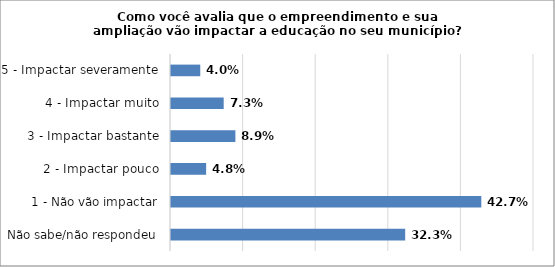
| Category | Series 0 |
|---|---|
| Não sabe/não respondeu | 0.323 |
| 1 - Não vão impactar | 0.427 |
| 2 - Impactar pouco | 0.048 |
| 3 - Impactar bastante | 0.089 |
| 4 - Impactar muito | 0.073 |
| 5 - Impactar severamente | 0.04 |